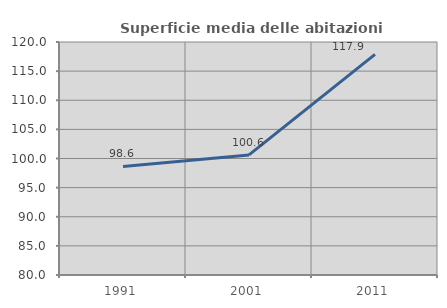
| Category | Superficie media delle abitazioni occupate |
|---|---|
| 1991.0 | 98.639 |
| 2001.0 | 100.613 |
| 2011.0 | 117.874 |